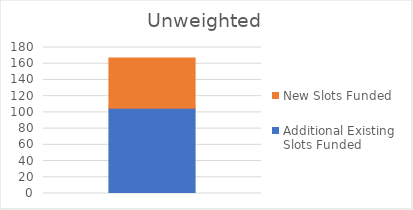
| Category | Additional Existing Slots Funded | New Slots Funded |
|---|---|---|
| Total | 105 | 62 |